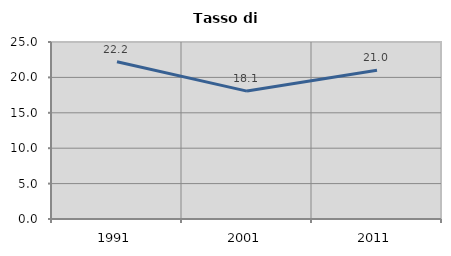
| Category | Tasso di disoccupazione   |
|---|---|
| 1991.0 | 22.222 |
| 2001.0 | 18.066 |
| 2011.0 | 21.019 |